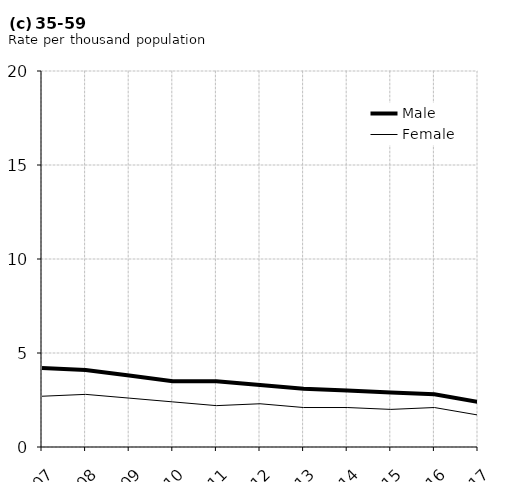
| Category | Male | Female |
|---|---|---|
| 2007.0 | 4.2 | 2.7 |
| 2008.0 | 4.1 | 2.8 |
| 2009.0 | 3.8 | 2.6 |
| 2010.0 | 3.5 | 2.4 |
| 2011.0 | 3.5 | 2.2 |
| 2012.0 | 3.3 | 2.3 |
| 2013.0 | 3.1 | 2.1 |
| 2014.0 | 3 | 2.1 |
| 2015.0 | 2.9 | 2 |
| 2016.0 | 2.8 | 2.1 |
| 2017.0 | 2.4 | 1.7 |